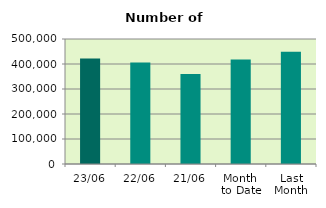
| Category | Series 0 |
|---|---|
| 23/06 | 422050 |
| 22/06 | 406382 |
| 21/06 | 359612 |
| Month 
to Date | 417642.235 |
| Last
Month | 449234.545 |